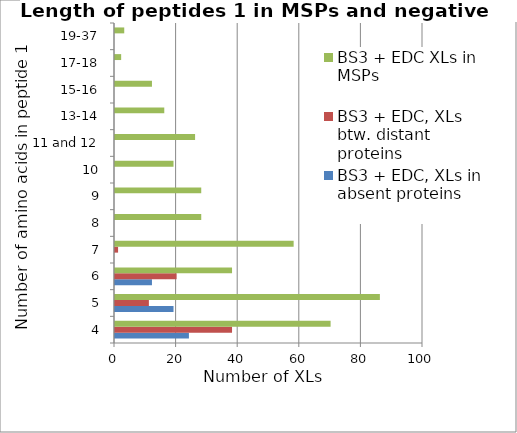
| Category | BS3 + EDC, XLs in absent proteins | BS3 + EDC, XLs btw. distant proteins | BS3 + EDC XLs in MSPs |
|---|---|---|---|
| 4 | 24 | 38 | 70 |
| 5 | 19 | 11 | 86 |
| 6 | 12 | 20 | 38 |
| 7 | 0 | 1 | 58 |
| 8 | 0 | 0 | 28 |
| 9 | 0 | 0 | 28 |
| 10 | 0 | 0 | 19 |
| 11 and 12 | 0 | 0 | 26 |
| 13-14 | 0 | 0 | 16 |
| 15-16 | 0 | 0 | 12 |
| 17-18 | 0 | 0 | 2 |
| 19-37 | 0 | 0 | 3 |